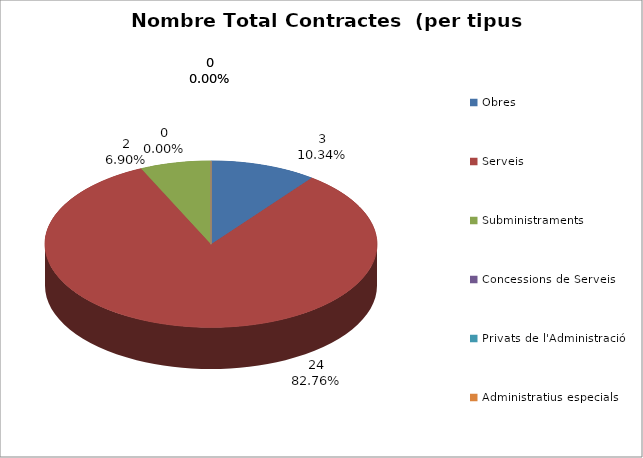
| Category | Nombre Total Contractes |
|---|---|
| Obres | 3 |
| Serveis | 24 |
| Subministraments | 2 |
| Concessions de Serveis | 0 |
| Privats de l'Administració | 0 |
| Administratius especials | 0 |